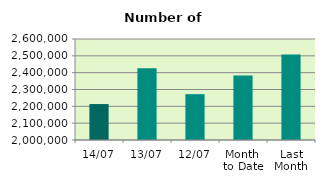
| Category | Series 0 |
|---|---|
| 14/07 | 2213580 |
| 13/07 | 2426752 |
| 12/07 | 2272422 |
| Month 
to Date | 2382520.2 |
| Last
Month | 2507488.545 |